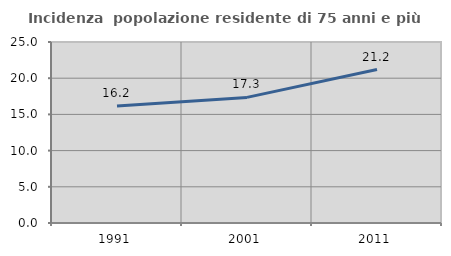
| Category | Incidenza  popolazione residente di 75 anni e più |
|---|---|
| 1991.0 | 16.17 |
| 2001.0 | 17.349 |
| 2011.0 | 21.194 |